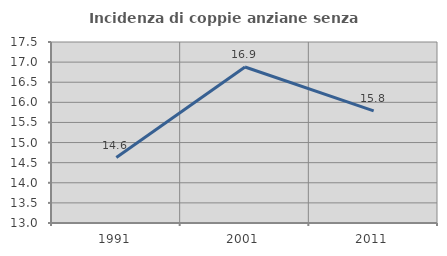
| Category | Incidenza di coppie anziane senza figli  |
|---|---|
| 1991.0 | 14.627 |
| 2001.0 | 16.879 |
| 2011.0 | 15.789 |